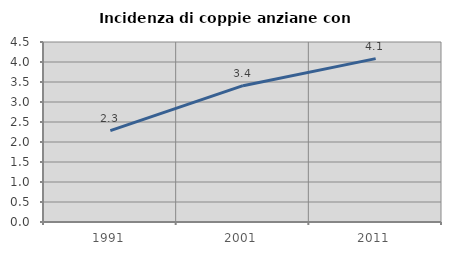
| Category | Incidenza di coppie anziane con figli |
|---|---|
| 1991.0 | 2.284 |
| 2001.0 | 3.408 |
| 2011.0 | 4.084 |